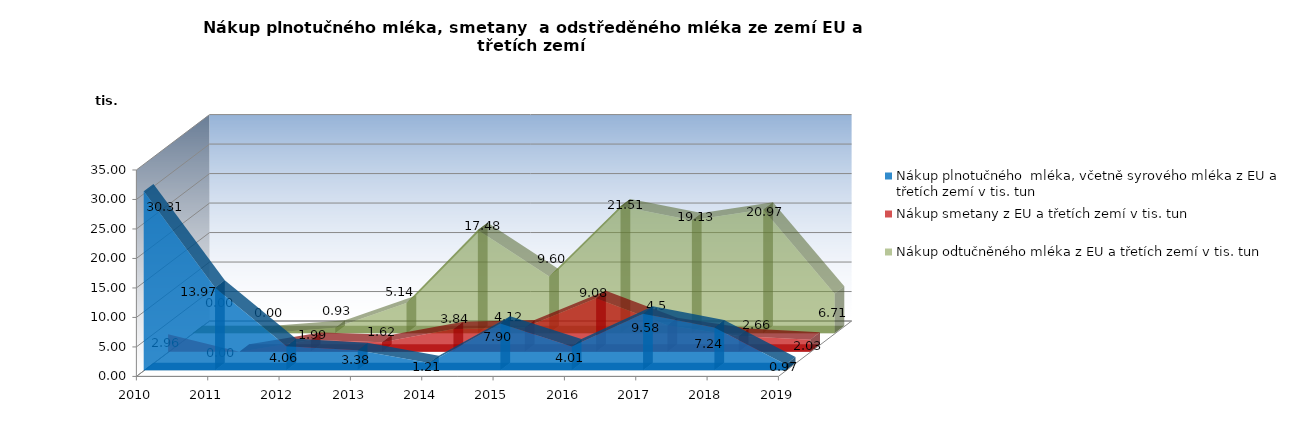
| Category | Nákup plnotučného  mléka, včetně syrového mléka z EU a třetích zemí v tis. tun | Nákup smetany z EU a třetích zemí v tis. tun | Nákup odtučněného mléka z EU a třetích zemí v tis. tun |
|---|---|---|---|
| 2010.0 | 30.31 | 2.96 | 0 |
| 2011.0 | 13.97 | 0 | 0 |
| 2012.0 | 4.06 | 1.99 | 0.93 |
| 2013.0 | 3.38 | 1.62 | 5.14 |
| 2014.0 | 1.21 | 3.84 | 17.48 |
| 2015.0 | 7.9 | 4.12 | 9.6 |
| 2016.0 | 4.01 | 9.08 | 21.514 |
| 2017.0 | 9.58 | 4.5 | 19.133 |
| 2018.0 | 7.24 | 2.66 | 20.972 |
| 2019.0 | 0.967 | 2.034 | 6.711 |